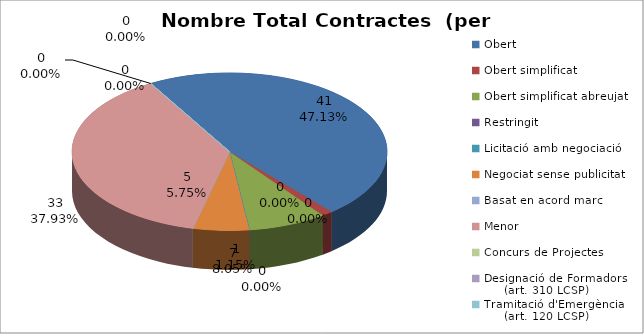
| Category | Nombre Total Contractes |
|---|---|
| Obert | 41 |
| Obert simplificat | 1 |
| Obert simplificat abreujat | 7 |
| Restringit | 0 |
| Licitació amb negociació | 0 |
| Negociat sense publicitat | 5 |
| Basat en acord marc | 0 |
| Menor | 33 |
| Concurs de Projectes | 0 |
| Designació de Formadors
     (art. 310 LCSP) | 0 |
| Tramitació d'Emergència
     (art. 120 LCSP) | 0 |